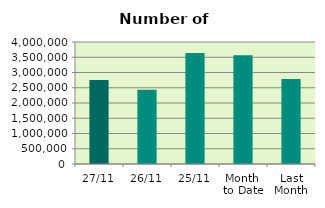
| Category | Series 0 |
|---|---|
| 27/11 | 2757098 |
| 26/11 | 2434976 |
| 25/11 | 3641894 |
| Month 
to Date | 3565625.4 |
| Last
Month | 2784183.182 |